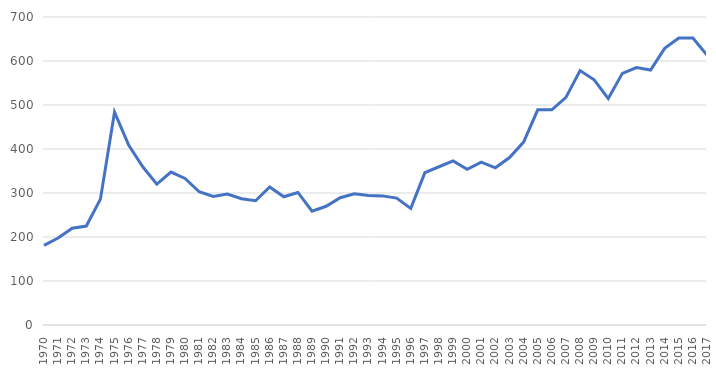
| Category | Series 0 |
|---|---|
| 1970.0 | 180.897 |
| 1971.0 | 197.746 |
| 1972.0 | 220.007 |
| 1973.0 | 224.841 |
| 1974.0 | 286.097 |
| 1975.0 | 483.831 |
| 1976.0 | 409.145 |
| 1977.0 | 359.581 |
| 1978.0 | 320.253 |
| 1979.0 | 347.51 |
| 1980.0 | 333.18 |
| 1981.0 | 302.904 |
| 1982.0 | 292.163 |
| 1983.0 | 297.486 |
| 1984.0 | 286.873 |
| 1985.0 | 282.455 |
| 1986.0 | 313.8 |
| 1987.0 | 291.354 |
| 1988.0 | 301.219 |
| 1989.0 | 258.503 |
| 1990.0 | 269.811 |
| 1991.0 | 289.234 |
| 1992.0 | 298.161 |
| 1993.0 | 294.411 |
| 1994.0 | 293.459 |
| 1995.0 | 288.484 |
| 1996.0 | 265.113 |
| 1997.0 | 346.244 |
| 1998.0 | 359.646 |
| 1999.0 | 372.95 |
| 2000.0 | 353.709 |
| 2001.0 | 370.178 |
| 2002.0 | 357.3 |
| 2003.0 | 380.487 |
| 2004.0 | 415.739 |
| 2005.0 | 489.14 |
| 2006.0 | 489.157 |
| 2007.0 | 517.356 |
| 2008.0 | 578.244 |
| 2009.0 | 557.327 |
| 2010.0 | 514.636 |
| 2011.0 | 571.838 |
| 2012.0 | 585.149 |
| 2013.0 | 579.529 |
| 2014.0 | 628.757 |
| 2015.0 | 652.048 |
| 2016.0 | 652.17 |
| 2017.0 | 613.64 |